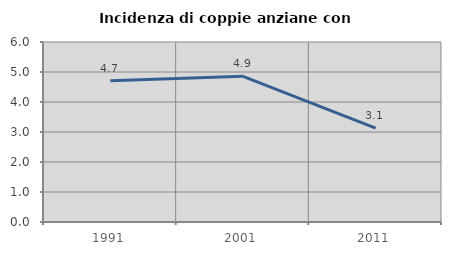
| Category | Incidenza di coppie anziane con figli |
|---|---|
| 1991.0 | 4.71 |
| 2001.0 | 4.854 |
| 2011.0 | 3.129 |